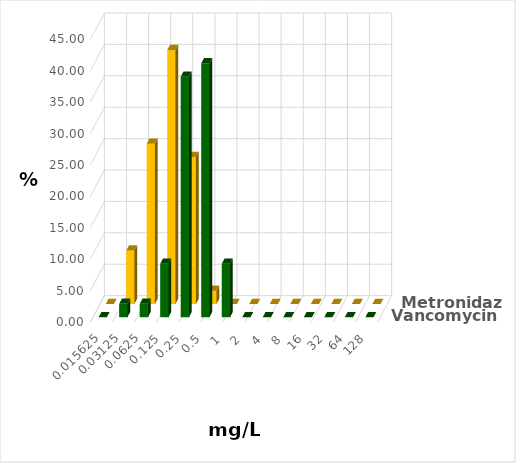
| Category | Vancomycin | Metronidazol |
|---|---|---|
| 0.015625 | 0 | 0 |
| 0.03125 | 2.128 | 8.511 |
| 0.0625 | 2.128 | 25.532 |
| 0.125 | 8.511 | 40.426 |
| 0.25 | 38.298 | 23.404 |
| 0.5 | 40.426 | 2.128 |
| 1.0 | 8.511 | 0 |
| 2.0 | 0 | 0 |
| 4.0 | 0 | 0 |
| 8.0 | 0 | 0 |
| 16.0 | 0 | 0 |
| 32.0 | 0 | 0 |
| 64.0 | 0 | 0 |
| 128.0 | 0 | 0 |